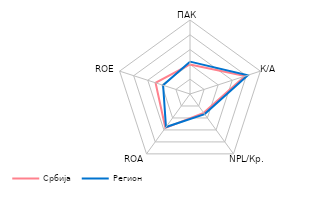
| Category | Србија | Регион |
|---|---|---|
| ПАК | 1.996 | 2.187 |
| К/А | 3.915 | 4.106 |
| NPL/Кр. | 1.572 | 1.679 |
| ROA | 2.832 | 2.762 |
| ROE | 2.447 | 1.911 |